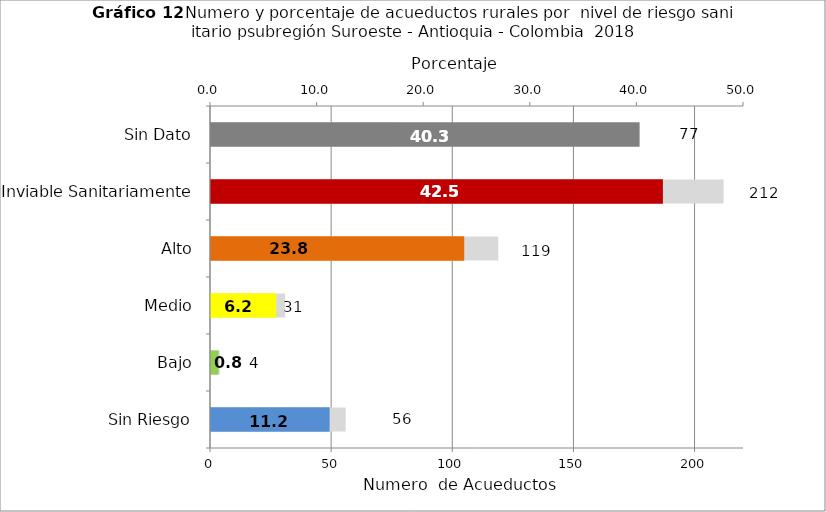
| Category | Número de Sistemas |
|---|---|
| Sin Riesgo | 56 |
| Bajo | 4 |
| Medio | 31 |
| Alto | 119 |
| Inviable Sanitariamente | 212 |
| Sin Dato | 77 |